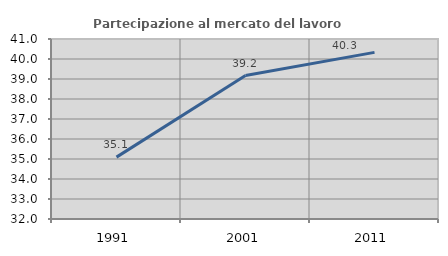
| Category | Partecipazione al mercato del lavoro  femminile |
|---|---|
| 1991.0 | 35.094 |
| 2001.0 | 39.171 |
| 2011.0 | 40.332 |